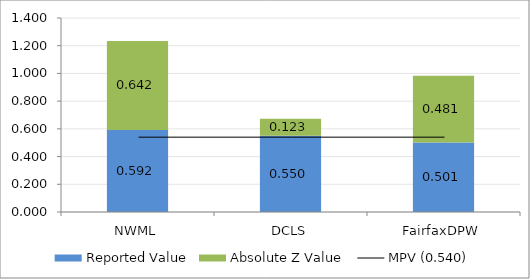
| Category | Reported Value | Absolute Z Value  |
|---|---|---|
| NWML | 0.592 | 0.642 |
| DCLS | 0.55 | 0.123 |
| FairfaxDPW | 0.501 | 0.481 |